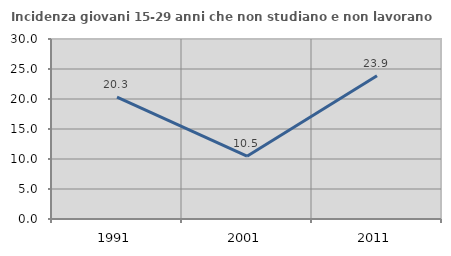
| Category | Incidenza giovani 15-29 anni che non studiano e non lavorano  |
|---|---|
| 1991.0 | 20.325 |
| 2001.0 | 10.465 |
| 2011.0 | 23.881 |